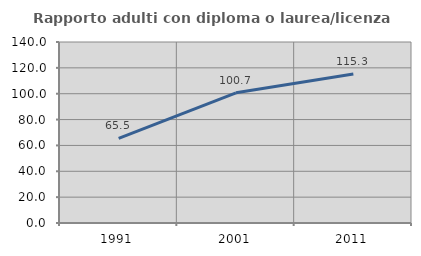
| Category | Rapporto adulti con diploma o laurea/licenza media  |
|---|---|
| 1991.0 | 65.455 |
| 2001.0 | 100.714 |
| 2011.0 | 115.323 |